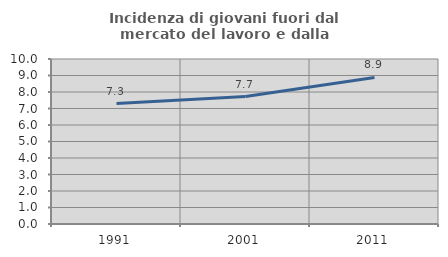
| Category | Incidenza di giovani fuori dal mercato del lavoro e dalla formazione  |
|---|---|
| 1991.0 | 7.3 |
| 2001.0 | 7.723 |
| 2011.0 | 8.883 |